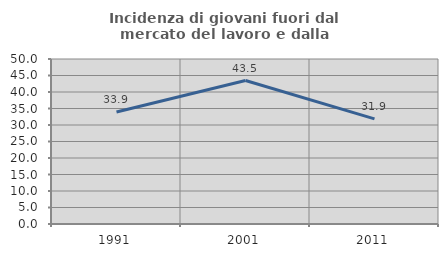
| Category | Incidenza di giovani fuori dal mercato del lavoro e dalla formazione  |
|---|---|
| 1991.0 | 33.943 |
| 2001.0 | 43.478 |
| 2011.0 | 31.859 |